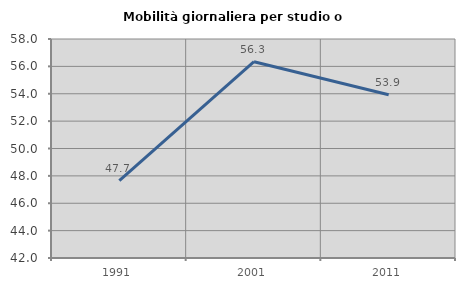
| Category | Mobilità giornaliera per studio o lavoro |
|---|---|
| 1991.0 | 47.661 |
| 2001.0 | 56.34 |
| 2011.0 | 53.927 |